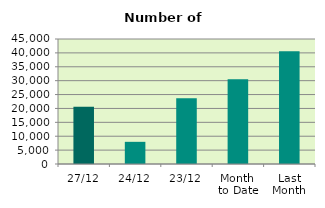
| Category | Series 0 |
|---|---|
| 27/12 | 20628 |
| 24/12 | 7982 |
| 23/12 | 23692 |
| Month 
to Date | 30491.474 |
| Last
Month | 40546.091 |